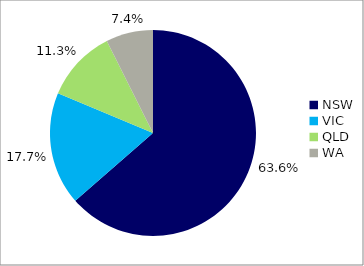
| Category | Series 0 |
|---|---|
| NSW | 0.636 |
| VIC | 0.177 |
| QLD | 0.113 |
| WA | 0.074 |